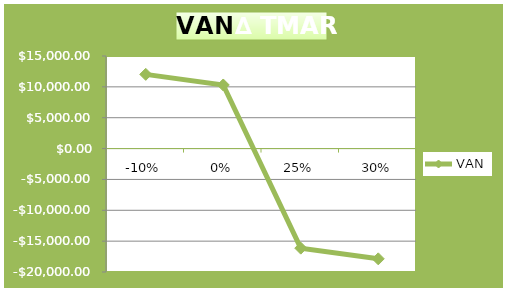
| Category | VAN |
|---|---|
| -0.1 | 12026.25 |
| 0.0 | 10301.021 |
| 0.25 | -16134.383 |
| 0.3 | -17867.048 |